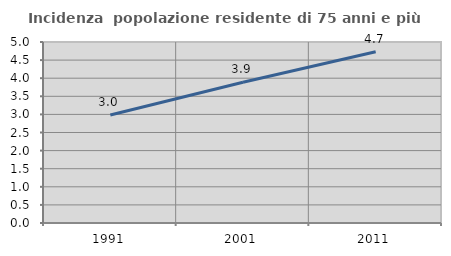
| Category | Incidenza  popolazione residente di 75 anni e più |
|---|---|
| 1991.0 | 2.981 |
| 2001.0 | 3.889 |
| 2011.0 | 4.731 |